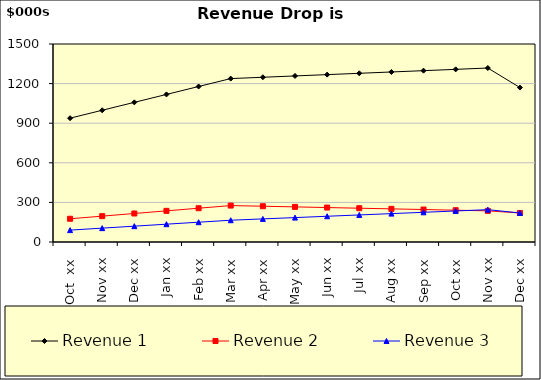
| Category | Revenue 1 | Revenue 2 | Revenue 3 |
|---|---|---|---|
| Oct  xx | 938 | 176 | 90 |
| Nov xx | 998 | 196 | 105 |
| Dec xx | 1058 | 216 | 120 |
| Jan xx | 1118 | 236 | 135 |
| Feb xx | 1178 | 256 | 150 |
| Mar xx | 1238 | 276 | 165 |
| Apr xx | 1248 | 271 | 175 |
| May xx | 1258 | 266 | 185 |
| Jun xx | 1268 | 261 | 195 |
| Jul xx | 1278 | 256 | 205 |
| Aug xx | 1288 | 251 | 215 |
| Sep xx | 1298 | 246 | 225 |
| Oct xx | 1308 | 241 | 235 |
| Nov xx | 1318 | 236 | 245 |
| Dec xx | 1170 | 220 | 220 |